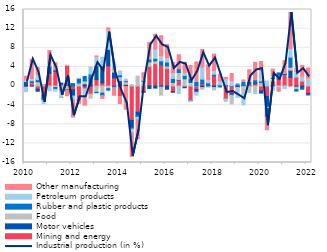
| Category | Mining and energy | Motor vehicles | Food  | Rubber and plastic products | Petroleum products | Other manufacturing |
|---|---|---|---|---|---|---|
| 2010 | -0.25 | 0.917 | 0.255 | -0.052 | -0.879 | 0.861 |
| II | 0.533 | -0.006 | 0.112 | 0.442 | 0.263 | 4.234 |
| III | -0.658 | -0.442 | 0.905 | 0.421 | 0.821 | 1.732 |
| IV | -1.977 | -0.557 | 0.067 | -0.479 | -0.692 | 0.217 |
| 2011 | 2.629 | 1.148 | -0.147 | 0.26 | -0.854 | 3.398 |
| II | 3.096 | 0.115 | -0.324 | -0.379 | -0.372 | 1.665 |
| III | 0.396 | 0.213 | -0.786 | -0.054 | -1.543 | -0.157 |
| IV | 4.311 | -0.093 | -0.663 | -0.13 | 0.016 | -1.363 |
| 2012 | -0.795 | -1.326 | -0.05 | 0.507 | -0.692 | -3.847 |
| II | -2.992 | -0.038 | 0.619 | 0.964 | 0.007 | -0.81 |
| III | -0.594 | 0.455 | 0.596 | 0.935 | -1.603 | -2.027 |
| IV | -1.693 | 1.755 | -0.844 | 0.748 | 1.327 | 0.117 |
| 2013 | 1.379 | 2.888 | -1.307 | -0.096 | 1.688 | 0.348 |
| II | 0.67 | 3.522 | -1.489 | -0.51 | 1.83 | -0.806 |
| III | 4.231 | 3.434 | -0.568 | -0.304 | 3.797 | 0.673 |
| IV | 1.696 | 1.208 | 1.158 | -0.334 | 0.847 | -1.596 |
| 2014 | -2.161 | 1.13 | 0.807 | 0.393 | 0.802 | -1.723 |
| II | -0.11 | 0.347 | 0.545 | 0.211 | 0.344 | -4.95 |
| III | -7.18 | -1.514 | 0.263 | -0.321 | -0.737 | -5.186 |
| IV | -5.474 | -0.682 | 2.045 | -0.385 | -0.515 | -4.159 |
| 2015 | -1.166 | -0.124 | 0.988 | 0.199 | 0.193 | 1.4 |
| II | 4.108 | -0.512 | 0.939 | 0.612 | 0.045 | 3.428 |
| III | 4.672 | -0.433 | 0.58 | 0.533 | 1.685 | 3.367 |
| IV | 4.374 | -0.256 | -1.658 | 0.889 | 0.776 | 4.489 |
| 2016 | 3.704 | -0.676 | 0.466 | 0.847 | 0.604 | 3.087 |
| II | -1.157 | -0.153 | 0.726 | 0.855 | 0.971 | 2.402 |
| III | 1.195 | 0.118 | 1.515 | 0.608 | -1.596 | 3.097 |
| IV | -0.146 | -0.226 | 1.508 | 0.71 | 0.276 | 2.462 |
| 2017 | -3.027 | -0.05 | 0.748 | 0.731 | -0.158 | 2.839 |
| II | -0.719 | -0.58 | 0.035 | 0.706 | -0.624 | 4.3 |
| III | 0.456 | -0.334 | -0.348 | 0.978 | 2.27 | 3.953 |
| IV | -0.07 | 0.021 | -0.156 | 0.647 | 0.422 | 3.284 |
| 2018 | 2.099 | -0.328 | -0.488 | 0.366 | 0.453 | 3.762 |
| II | 0.302 | 0.019 | -0.018 | -0.182 | 0.477 | 1.645 |
| III | -2.651 | -0.029 | -0.529 | 0.253 | 1.076 | 0.486 |
| IV | -1.597 | -0.347 | -1.812 | 0.072 | 0.771 | 1.766 |
| 2019 | -0.079 | -0.235 | -0.646 | 0.265 | -1.418 | 0.224 |
| II | 0.197 | -0.13 | -1.544 | 0.553 | -2.246 | 0.509 |
| III | 0.401 | -0.045 | -1.239 | 0.42 | -0.078 | 2.588 |
| IV | 0.463 | 0.224 | -1.281 | 0.441 | -0.334 | 3.839 |
| 2020 | -1.019 | -0.467 | 0.75 | 0.317 | 1.951 | 2.101 |
| II | -2.182 | -2.255 | -0.246 | -1.832 | 1.059 | -2.852 |
| III | 1.043 | -0.11 | 0.514 | 0.101 | -0.806 | 1.889 |
| IV | 1.474 | 0.245 | 0.531 | 0.493 | -0.344 | -0.959 |
| 2021 | 2.44 | 0.018 | -0.05 | 0.011 | -0.499 | 2.847 |
| II | 1.812 | 1.497 | 0.622 | 2.097 | 1.568 | 7.778 |
| III | 1.87 | -0.247 | -0.495 | -0.327 | 0.952 | 0.919 |
| IV | 1.066 | -0.406 | 0.014 | -0.279 | 0.727 | 2.524 |
| 2022 | -1.584 | -0.211 | 0.287 | -0.082 | 1.109 | 2.381 |